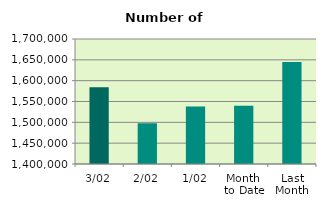
| Category | Series 0 |
|---|---|
| 3/02 | 1584298 |
| 2/02 | 1497860 |
| 1/02 | 1537796 |
| Month 
to Date | 1539984.667 |
| Last
Month | 1644892 |